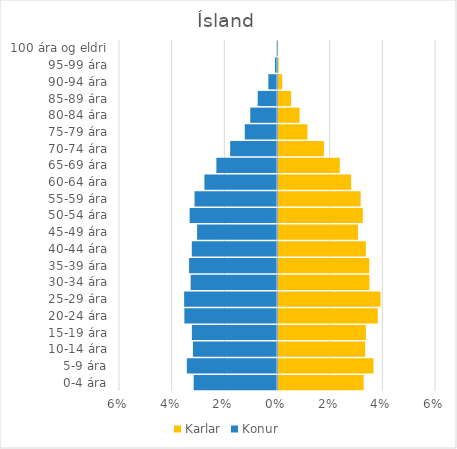
| Category | Karlar | Konur |
|---|---|---|
| 0-4 ára | 0.033 | -0.032 |
| 5-9 ára | 0.036 | -0.034 |
| 10-14 ára | 0.033 | -0.032 |
| 15-19 ára | 0.033 | -0.032 |
| 20-24 ára | 0.038 | -0.035 |
| 25-29 ára | 0.039 | -0.035 |
| 30-34 ára | 0.035 | -0.033 |
| 35-39 ára | 0.035 | -0.033 |
| 40-44 ára | 0.033 | -0.032 |
| 45-49 ára | 0.03 | -0.03 |
| 50-54 ára | 0.032 | -0.033 |
| 55-59 ára | 0.031 | -0.031 |
| 60-64 ára | 0.028 | -0.028 |
| 65-69 ára | 0.023 | -0.023 |
| 70-74 ára | 0.017 | -0.018 |
| 75-79 ára | 0.011 | -0.012 |
| 80-84 ára | 0.008 | -0.01 |
| 85-89 ára | 0.005 | -0.007 |
| 90-94 ára | 0.002 | -0.003 |
| 95-99 ára | 0 | -0.001 |
| 100 ára og eldri | 0 | 0 |